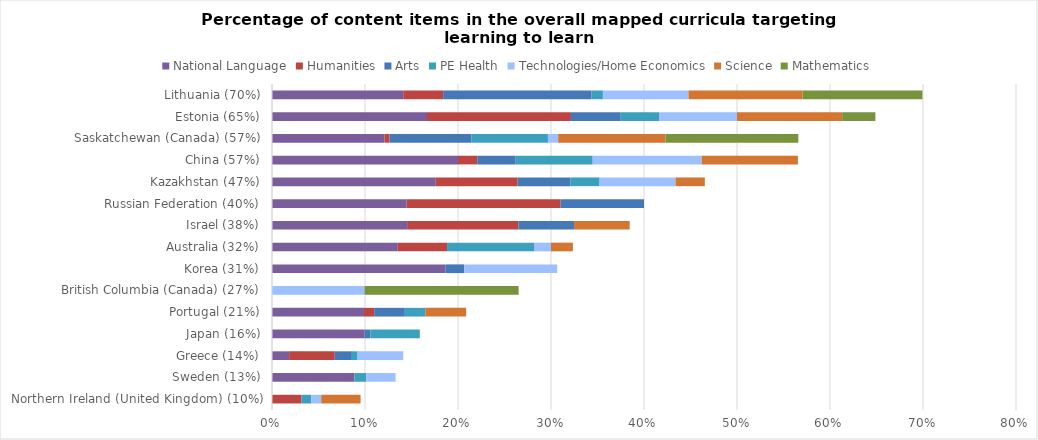
| Category | National Language | Humanities | Arts | PE Health | Technologies/Home Economics | Science | Mathematics |
|---|---|---|---|---|---|---|---|
| Northern Ireland (United Kingdom) (10%) | 0 | 0.032 | 0 | 0.011 | 0.011 | 0.042 | 0 |
| Sweden (13%) | 0.089 | 0 | 0 | 0.013 | 0.032 | 0 | 0 |
| Greece (14%) | 0.018 | 0.049 | 0.018 | 0.006 | 0.049 | 0 | 0 |
| Japan (16%) | 0.099 | 0 | 0.007 | 0.053 | 0 | 0 | 0 |
| Portugal (21%) | 0.099 | 0.011 | 0.033 | 0.022 | 0 | 0.044 | 0 |
| British Columbia (Canada) (27%) | 0 | 0 | 0 | 0 | 0.099 | 0 | 0.166 |
| Korea (31%) | 0.187 | 0 | 0.02 | 0 | 0.1 | 0 | 0 |
| Australia (32%) | 0.135 | 0.053 | 0 | 0.094 | 0.018 | 0.024 | 0 |
| Israel (38%) | 0.145 | 0.12 | 0.06 | 0 | 0 | 0.06 | 0 |
| Russian Federation (40%) | 0.145 | 0.166 | 0.09 | 0 | 0 | 0 | 0 |
| Kazakhstan (47%) | 0.176 | 0.088 | 0.057 | 0.031 | 0.082 | 0.031 | 0 |
| China (57%) | 0.2 | 0.021 | 0.041 | 0.083 | 0.117 | 0.103 | 0 |
| Saskatchewan (Canada) (57%) | 0.121 | 0.005 | 0.088 | 0.082 | 0.011 | 0.115 | 0.143 |
| Estonia (65%) | 0.167 | 0.155 | 0.054 | 0.042 | 0.083 | 0.113 | 0.036 |
| Lithuania (70%) | 0.141 | 0.043 | 0.16 | 0.012 | 0.092 | 0.123 | 0.129 |